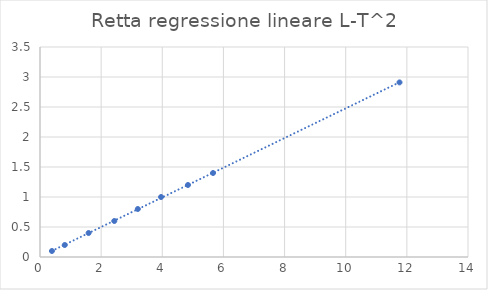
| Category | Series 0 |
|---|---|
| 0.39 | 0.1 |
| 0.81 | 0.2 |
| 1.59 | 0.4 |
| 2.43 | 0.6 |
| 3.2 | 0.8 |
| 3.96 | 1 |
| 4.84 | 1.2 |
| 5.66 | 1.4 |
| 11.76 | 2.91 |